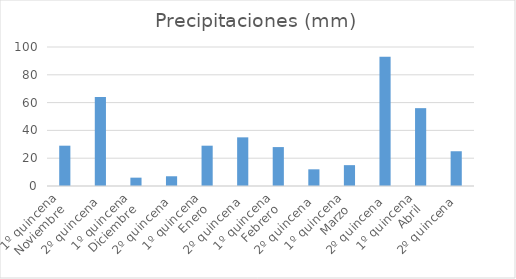
| Category | Series 0 |
|---|---|
| 0 | 29 |
| 1 | 64 |
| 2 | 6 |
| 3 | 7 |
| 4 | 29 |
| 5 | 35 |
| 6 | 28 |
| 7 | 12 |
| 8 | 15 |
| 9 | 93 |
| 10 | 56 |
| 11 | 25 |